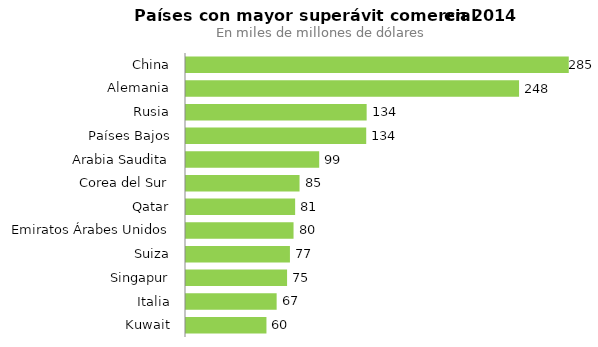
| Category | Series 0 |
|---|---|
| China | 284.942 |
| Alemania | 247.94 |
| Rusia | 134.48 |
| Países Bajos | 134.157 |
| Arabia Saudita | 99.158 |
| Corea del Sur | 84.525 |
| Qatar | 81.238 |
| Emiratos Árabes Unidos | 80.054 |
| Suiza | 77.372 |
| Singapur | 75.239 |
| Italia | 67.476 |
| Kuwait | 59.89 |